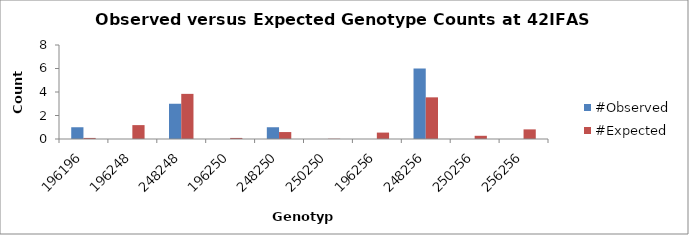
| Category | #Observed | #Expected |
|---|---|---|
| 196196.0 | 1 | 0.091 |
| 196248.0 | 0 | 1.182 |
| 248248.0 | 3 | 3.841 |
| 196250.0 | 0 | 0.091 |
| 248250.0 | 1 | 0.591 |
| 250250.0 | 0 | 0.023 |
| 196256.0 | 0 | 0.545 |
| 248256.0 | 6 | 3.545 |
| 250256.0 | 0 | 0.273 |
| 256256.0 | 0 | 0.818 |